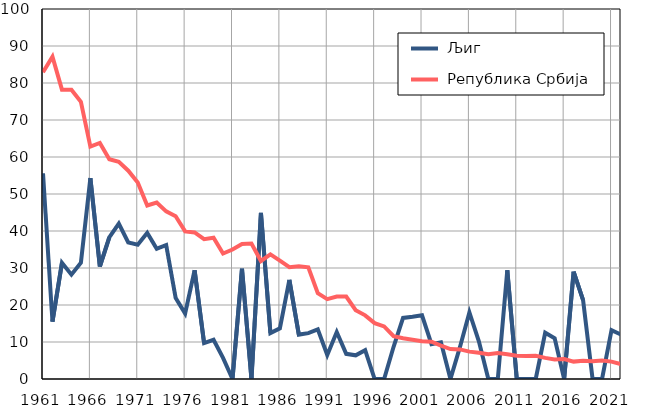
| Category |  Љиг |  Република Србија |
|---|---|---|
| 1961.0 | 55.6 | 82.9 |
| 1962.0 | 15.5 | 87.1 |
| 1963.0 | 31.4 | 78.2 |
| 1964.0 | 28.2 | 78.2 |
| 1965.0 | 31.4 | 74.9 |
| 1966.0 | 54.3 | 62.8 |
| 1967.0 | 30.4 | 63.8 |
| 1968.0 | 38.3 | 59.4 |
| 1969.0 | 42 | 58.7 |
| 1970.0 | 36.9 | 56.3 |
| 1971.0 | 36.3 | 53.1 |
| 1972.0 | 39.5 | 46.9 |
| 1973.0 | 35.2 | 47.7 |
| 1974.0 | 36.2 | 45.3 |
| 1975.0 | 21.9 | 44 |
| 1976.0 | 17.7 | 39.9 |
| 1977.0 | 29.4 | 39.6 |
| 1978.0 | 9.7 | 37.8 |
| 1979.0 | 10.6 | 38.2 |
| 1980.0 | 5.7 | 33.9 |
| 1981.0 | 0 | 35 |
| 1982.0 | 29.8 | 36.5 |
| 1983.0 | 0 | 36.6 |
| 1984.0 | 44.9 | 31.9 |
| 1985.0 | 12.4 | 33.7 |
| 1986.0 | 13.7 | 32 |
| 1987.0 | 26.8 | 30.2 |
| 1988.0 | 12 | 30.5 |
| 1989.0 | 12.4 | 30.2 |
| 1990.0 | 13.4 | 23.2 |
| 1991.0 | 6.5 | 21.6 |
| 1992.0 | 12.7 | 22.3 |
| 1993.0 | 6.8 | 22.3 |
| 1994.0 | 6.4 | 18.6 |
| 1995.0 | 7.8 | 17.2 |
| 1996.0 | 0 | 15.1 |
| 1997.0 | 0 | 14.2 |
| 1998.0 | 8.7 | 11.6 |
| 1999.0 | 16.5 | 11 |
| 2000.0 | 16.8 | 10.6 |
| 2001.0 | 17.2 | 10.2 |
| 2002.0 | 9.4 | 10.1 |
| 2003.0 | 9.9 | 9 |
| 2004.0 | 0 | 8.1 |
| 2005.0 | 8.6 | 8 |
| 2006.0 | 18 | 7.4 |
| 2007.0 | 10.2 | 7.1 |
| 2008.0 | 0 | 6.7 |
| 2009.0 | 0 | 7 |
| 2010.0 | 29.4 | 6.7 |
| 2011.0 | 0 | 6.3 |
| 2012.0 | 0 | 6.2 |
| 2013.0 | 0 | 6.3 |
| 2014.0 | 12.5 | 5.7 |
| 2015.0 | 11 | 5.3 |
| 2016.0 | 0 | 5.4 |
| 2017.0 | 29 | 4.7 |
| 2018.0 | 21.3 | 4.9 |
| 2019.0 | 0 | 4.8 |
| 2020.0 | 0 | 5 |
| 2021.0 | 13.2 | 4.7 |
| 2022.0 | 12 | 4 |